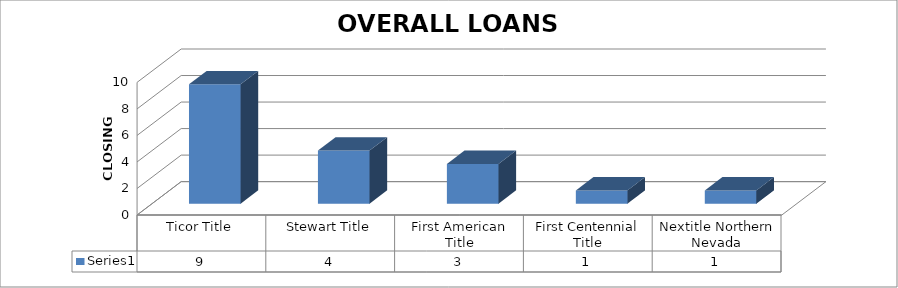
| Category | Series 0 |
|---|---|
| Ticor Title | 9 |
| Stewart Title | 4 |
| First American Title | 3 |
| First Centennial Title | 1 |
| Nextitle Northern Nevada | 1 |